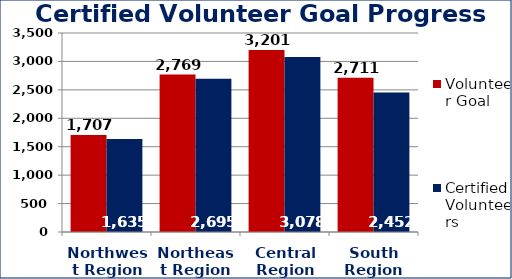
| Category | Volunteer Goal  | Certified Volunteers  |
|---|---|---|
| Northwest Region | 1707 | 1635 |
| Northeast Region | 2769 | 2695 |
| Central Region | 3201 | 3078 |
| South Region | 2711 | 2452 |